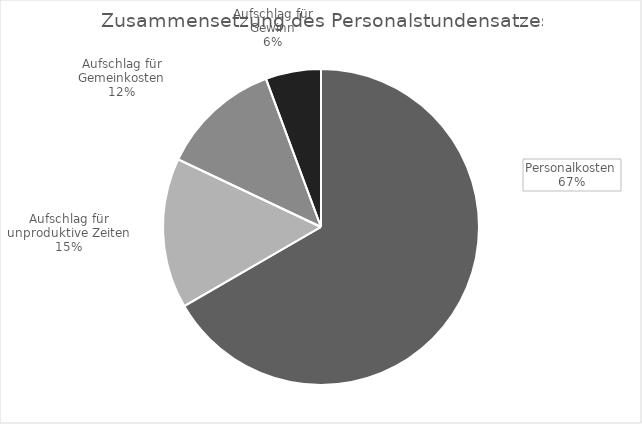
| Category | Series 0 |
|---|---|
| Personalkosten | 24.164 |
| Aufschlag für unproduktive Zeiten | 5.576 |
| Aufschlag für Gemeinkosten | 4.461 |
| Aufschlag für Gewinn | 2.052 |